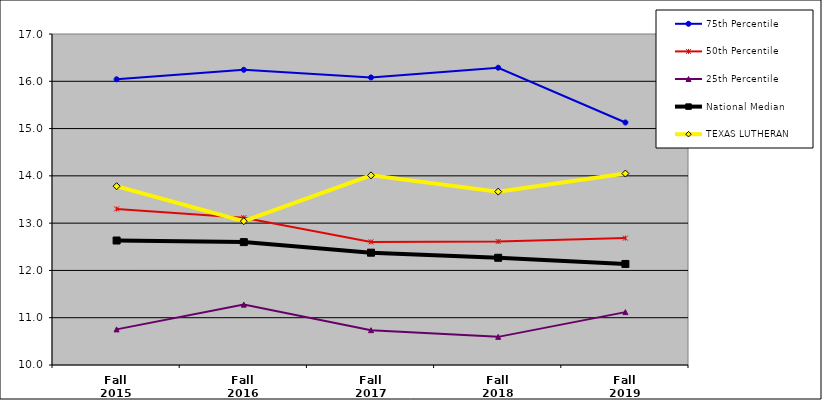
| Category | 75th Percentile | 50th Percentile | 25th Percentile | National Median | TEXAS LUTHERAN |
|---|---|---|---|---|---|
| Fall 2015 | 16.042 | 13.3 | 10.753 | 12.633 | 13.781 |
| Fall 2016 | 16.243 | 13.115 | 11.277 | 12.599 | 13.042 |
| Fall 2017 | 16.081 | 12.603 | 10.737 | 12.375 | 14.01 |
| Fall 2018 | 16.287 | 12.612 | 10.595 | 12.268 | 13.667 |
| Fall 2019 | 15.129 | 12.684 | 11.118 | 12.137 | 14.049 |